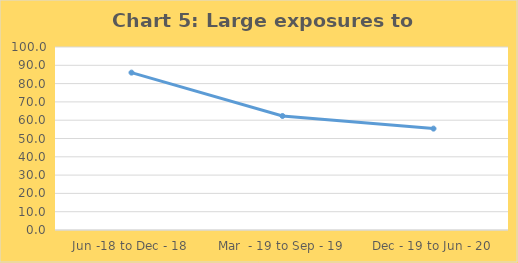
| Category | Large exposures to capital |
|---|---|
| Jun -18 to Dec - 18 | 86 |
| Mar  - 19 to Sep - 19 | 62.3 |
| Dec - 19 to Jun - 20 | 55.4 |